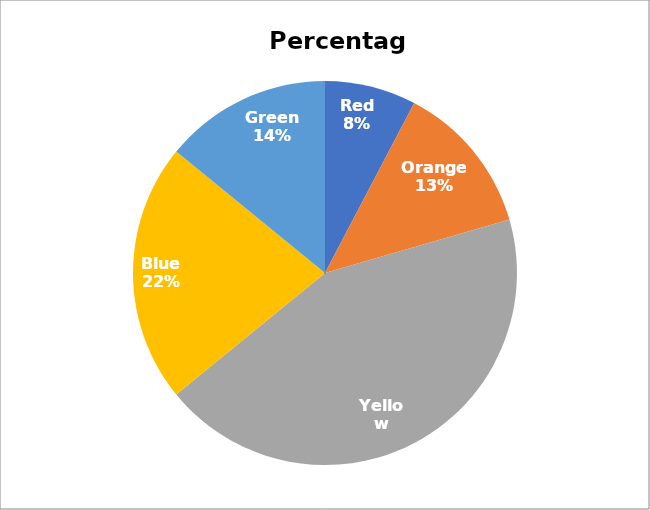
| Category | Series 0 |
|---|---|
| Red | 12 |
| Orange | 20 |
| Yellow | 68 |
| Blue | 34 |
| Green | 22 |